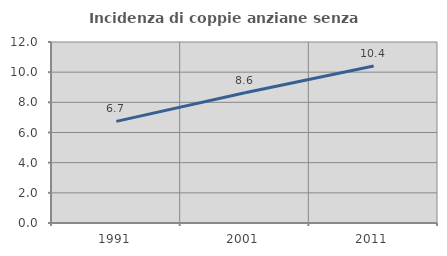
| Category | Incidenza di coppie anziane senza figli  |
|---|---|
| 1991.0 | 6.74 |
| 2001.0 | 8.64 |
| 2011.0 | 10.404 |